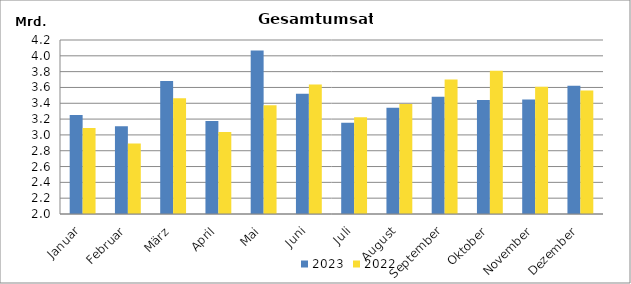
| Category | 2023 | 2022 |
|---|---|---|
| Januar | 3251246.967 | 3086435.164 |
| Februar | 3108794.771 | 2891128.196 |
| März | 3681379.953 | 3462722.121 |
| April | 3174544.705 | 3035677.218 |
| Mai | 4067860.971 | 3373759.063 |
| Juni | 3520366.91 | 3638840.087 |
| Juli | 3155062.141 | 3224830.379 |
| August | 3344405.738 | 3391624.898 |
| September | 3482107.84 | 3700595.663 |
| Oktober | 3441728.957 | 3811096.108 |
| November | 3446163.242 | 3609099.397 |
| Dezember | 3621026.042 | 3562184.689 |